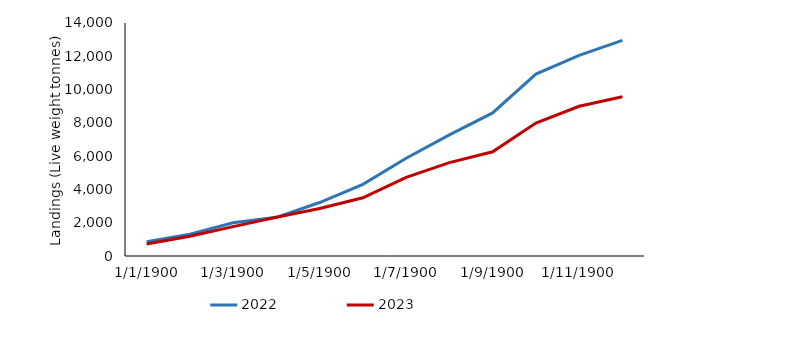
| Category | 2022 | 2023 |
|---|---|---|
| 0 | 859.409 | 723.137 |
| 1 | 1310.904 | 1192.23 |
| 2 | 2002.272 | 1766.376 |
| 3 | 2324.315 | 2332.774 |
| 4 | 3213.197 | 2855.708 |
| 5 | 4302.859 | 3498.65 |
| 6 | 5874.556 | 4727.097 |
| 7 | 7279.134 | 5609.908 |
| 8 | 8599.444 | 6263.49 |
| 9 | 10931.682 | 7986.138 |
| 10 | 12060.697 | 8996.71 |
| 11 | 12958.473 | 9568.604 |